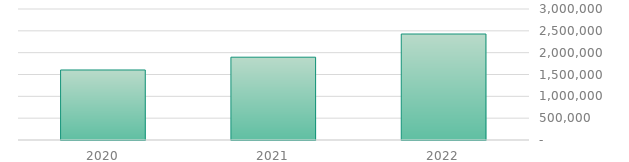
| Category | Operating expenses |
|---|---|
| 2022.0 | 2427451 |
| 2021.0 | 1896411 |
| 2020.0 | 1603492 |